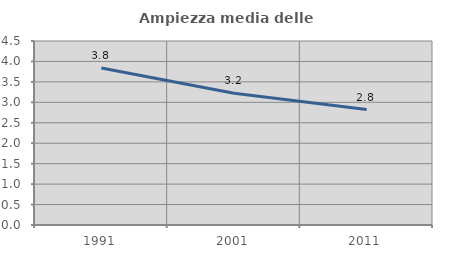
| Category | Ampiezza media delle famiglie |
|---|---|
| 1991.0 | 3.841 |
| 2001.0 | 3.223 |
| 2011.0 | 2.824 |